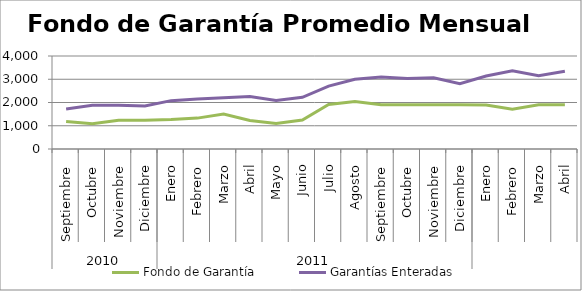
| Category | Fondo de Garantía | Garantías Enteradas |
|---|---|---|
| 0 | 1186.765 | 1723.136 |
| 1 | 1091.277 | 1878.561 |
| 2 | 1240.142 | 1886.493 |
| 3 | 1233.184 | 1848.941 |
| 4 | 1267.175 | 2079.773 |
| 5 | 1328.315 | 2151.804 |
| 6 | 1507.218 | 2200.488 |
| 7 | 1222.61 | 2253.818 |
| 8 | 1097.438 | 2081.441 |
| 9 | 1248.758 | 2223.666 |
| 10 | 1917.982 | 2706.525 |
| 11 | 2038.339 | 3002.384 |
| 12 | 1900.513 | 3095.395 |
| 13 | 1900.513 | 3029.373 |
| 14 | 1900.513 | 3060.179 |
| 15 | 1900.513 | 2809.042 |
| 16 | 1896.798 | 3141.641 |
| 17 | 1714.423 | 3362.648 |
| 18 | 1900.513 | 3154.118 |
| 19 | 1900.513 | 3348.058 |